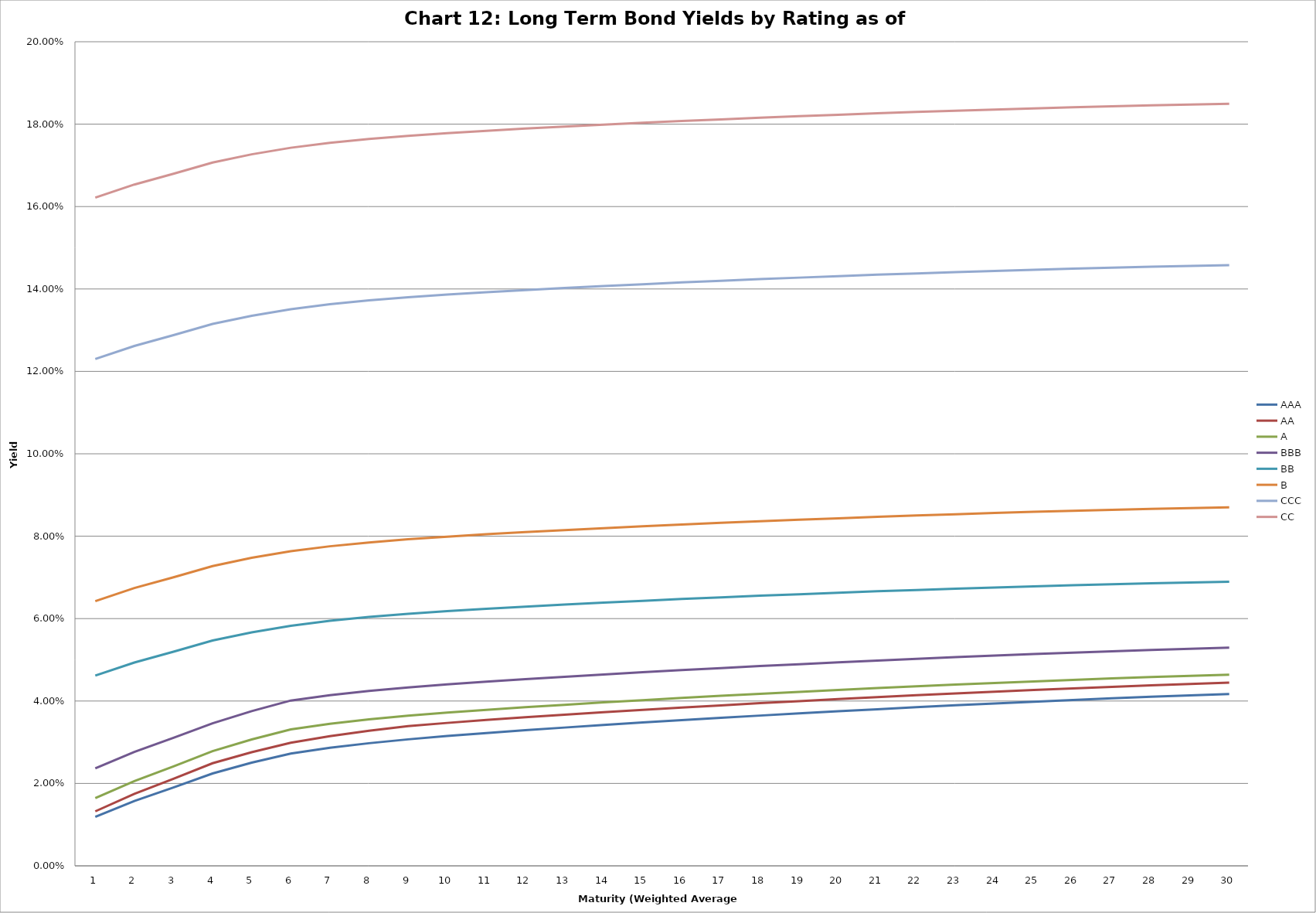
| Category | AAA | AA | A | BBB | BB | B | CCC | CC |
|---|---|---|---|---|---|---|---|---|
| 0 | 0.012 | 0.013 | 0.016 | 0.024 | 0.046 | 0.064 | 0.123 | 0.162 |
| 1 | 0.016 | 0.017 | 0.021 | 0.028 | 0.049 | 0.067 | 0.126 | 0.165 |
| 2 | 0.019 | 0.021 | 0.024 | 0.031 | 0.052 | 0.07 | 0.129 | 0.168 |
| 3 | 0.022 | 0.025 | 0.028 | 0.035 | 0.055 | 0.073 | 0.132 | 0.171 |
| 4 | 0.025 | 0.028 | 0.031 | 0.038 | 0.057 | 0.075 | 0.134 | 0.173 |
| 5 | 0.027 | 0.03 | 0.033 | 0.04 | 0.058 | 0.076 | 0.135 | 0.174 |
| 6 | 0.029 | 0.031 | 0.034 | 0.041 | 0.059 | 0.078 | 0.136 | 0.175 |
| 7 | 0.03 | 0.033 | 0.036 | 0.042 | 0.06 | 0.078 | 0.137 | 0.176 |
| 8 | 0.031 | 0.034 | 0.036 | 0.043 | 0.061 | 0.079 | 0.138 | 0.177 |
| 9 | 0.032 | 0.035 | 0.037 | 0.044 | 0.062 | 0.08 | 0.139 | 0.178 |
| 10 | 0.032 | 0.035 | 0.038 | 0.045 | 0.062 | 0.08 | 0.139 | 0.178 |
| 11 | 0.033 | 0.036 | 0.038 | 0.045 | 0.063 | 0.081 | 0.14 | 0.179 |
| 12 | 0.034 | 0.037 | 0.039 | 0.046 | 0.063 | 0.081 | 0.14 | 0.179 |
| 13 | 0.034 | 0.037 | 0.04 | 0.046 | 0.064 | 0.082 | 0.141 | 0.18 |
| 14 | 0.035 | 0.038 | 0.04 | 0.047 | 0.064 | 0.082 | 0.141 | 0.18 |
| 15 | 0.035 | 0.038 | 0.041 | 0.048 | 0.065 | 0.083 | 0.142 | 0.181 |
| 16 | 0.036 | 0.039 | 0.041 | 0.048 | 0.065 | 0.083 | 0.142 | 0.181 |
| 17 | 0.036 | 0.039 | 0.042 | 0.048 | 0.066 | 0.084 | 0.142 | 0.182 |
| 18 | 0.037 | 0.04 | 0.042 | 0.049 | 0.066 | 0.084 | 0.143 | 0.182 |
| 19 | 0.038 | 0.04 | 0.043 | 0.049 | 0.066 | 0.084 | 0.143 | 0.182 |
| 20 | 0.038 | 0.041 | 0.043 | 0.05 | 0.067 | 0.085 | 0.143 | 0.183 |
| 21 | 0.038 | 0.041 | 0.044 | 0.05 | 0.067 | 0.085 | 0.144 | 0.183 |
| 22 | 0.039 | 0.042 | 0.044 | 0.051 | 0.067 | 0.085 | 0.144 | 0.183 |
| 23 | 0.039 | 0.042 | 0.044 | 0.051 | 0.068 | 0.086 | 0.144 | 0.184 |
| 24 | 0.04 | 0.043 | 0.045 | 0.051 | 0.068 | 0.086 | 0.145 | 0.184 |
| 25 | 0.04 | 0.043 | 0.045 | 0.052 | 0.068 | 0.086 | 0.145 | 0.184 |
| 26 | 0.041 | 0.043 | 0.045 | 0.052 | 0.068 | 0.086 | 0.145 | 0.184 |
| 27 | 0.041 | 0.044 | 0.046 | 0.052 | 0.069 | 0.087 | 0.145 | 0.185 |
| 28 | 0.041 | 0.044 | 0.046 | 0.053 | 0.069 | 0.087 | 0.146 | 0.185 |
| 29 | 0.042 | 0.044 | 0.046 | 0.053 | 0.069 | 0.087 | 0.146 | 0.185 |